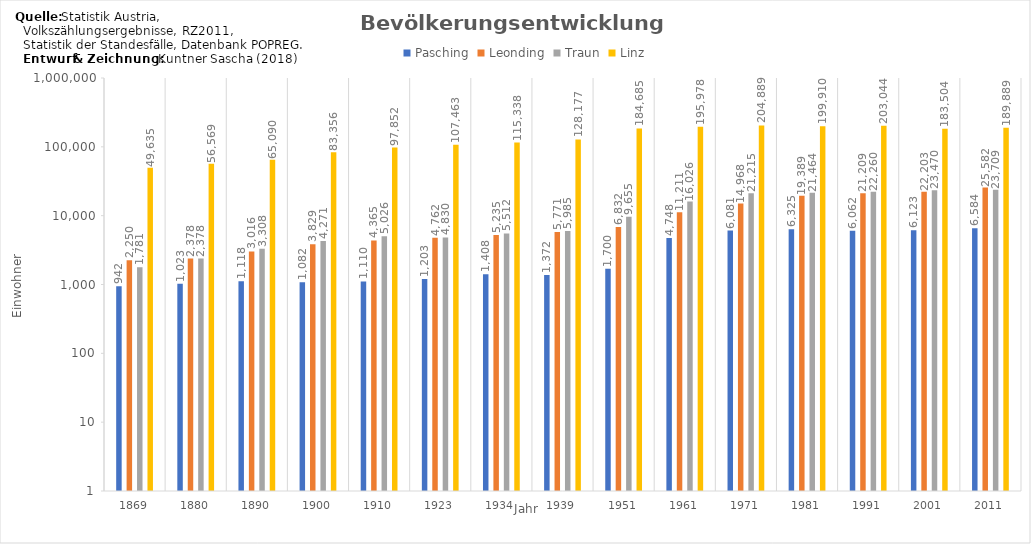
| Category | Pasching | Leonding | Traun | Linz |
|---|---|---|---|---|
| 1869.0 | 942 | 2250 | 1781 | 49635 |
| 1880.0 | 1023 | 2378 | 2378 | 56569 |
| 1890.0 | 1118 | 3016 | 3308 | 65090 |
| 1900.0 | 1082 | 3829 | 4271 | 83356 |
| 1910.0 | 1110 | 4365 | 5026 | 97852 |
| 1923.0 | 1203 | 4762 | 4830 | 107463 |
| 1934.0 | 1408 | 5235 | 5512 | 115338 |
| 1939.0 | 1372 | 5771 | 5985 | 128177 |
| 1951.0 | 1700 | 6832 | 9655 | 184685 |
| 1961.0 | 4748 | 11211 | 16026 | 195978 |
| 1971.0 | 6081 | 14968 | 21215 | 204889 |
| 1981.0 | 6325 | 19389 | 21464 | 199910 |
| 1991.0 | 6062 | 21209 | 22260 | 203044 |
| 2001.0 | 6123 | 22203 | 23470 | 183504 |
| 2011.0 | 6584 | 25582 | 23709 | 189889 |